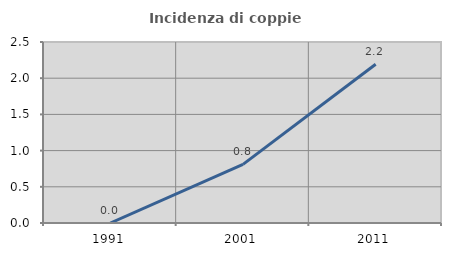
| Category | Incidenza di coppie miste |
|---|---|
| 1991.0 | 0 |
| 2001.0 | 0.81 |
| 2011.0 | 2.193 |